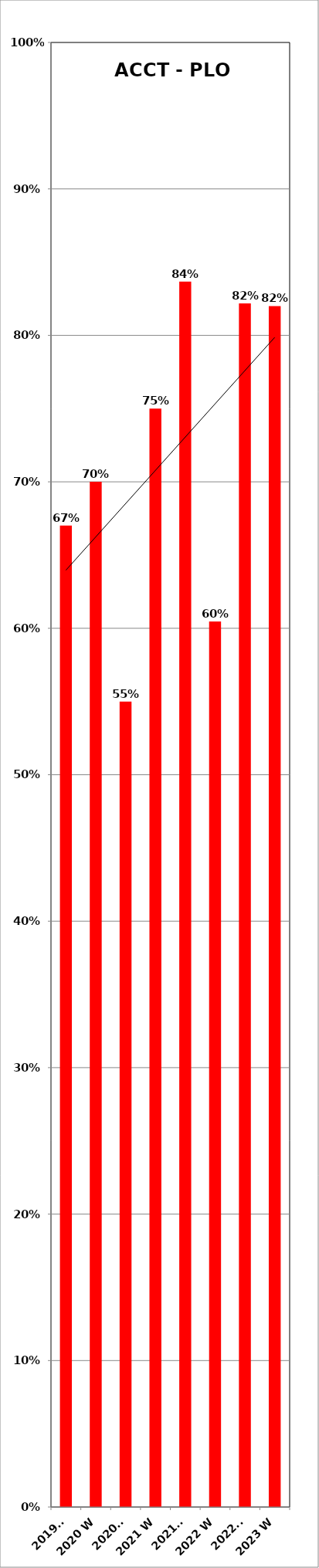
| Category | Series 0 |
|---|---|
| 2019 F | 0.67 |
| 2020 W | 0.7 |
| 2020 F | 0.55 |
| 2021 W | 0.75 |
| 2021 F | 0.837 |
| 2022 W | 0.605 |
| 2022 F | 0.822 |
| 2023 W | 0.82 |